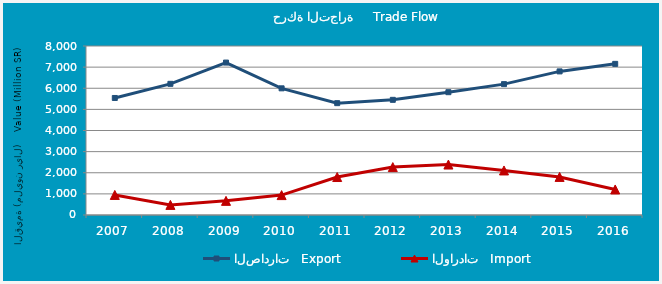
| Category | الصادرات   Export | الواردات   Import |
|---|---|---|
| 2007.0 | 5539.734 | 949.582 |
| 2008.0 | 6208.69 | 478.319 |
| 2009.0 | 7215.51 | 669.061 |
| 2010.0 | 5996.048 | 941.942 |
| 2011.0 | 5294.044 | 1797.349 |
| 2012.0 | 5451.725 | 2268.418 |
| 2013.0 | 5813.058 | 2388.767 |
| 2014.0 | 6195.239 | 2108.541 |
| 2015.0 | 6797.587 | 1802.931 |
| 2016.0 | 7154.526 | 1209.209 |